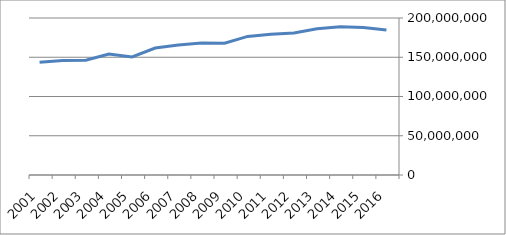
| Category | Series 0 |
|---|---|
| 2016.0 | 184716778.73 |
| 2015.0 | 188007502.55 |
| 2014.0 | 188724054.51 |
| 2013.0 | 186285889.65 |
| 2012.0 | 180779940 |
| 2011.0 | 179266602 |
| 2010.0 | 176572073 |
| 2009.0 | 167794969 |
| 2008.0 | 168124040 |
| 2007.0 | 165687794 |
| 2006.0 | 161747370 |
| 2005.0 | 150427838 |
| 2004.0 | 153991904 |
| 2003.0 | 146231211 |
| 2002.0 | 145838299 |
| 2001.0 | 143633516 |